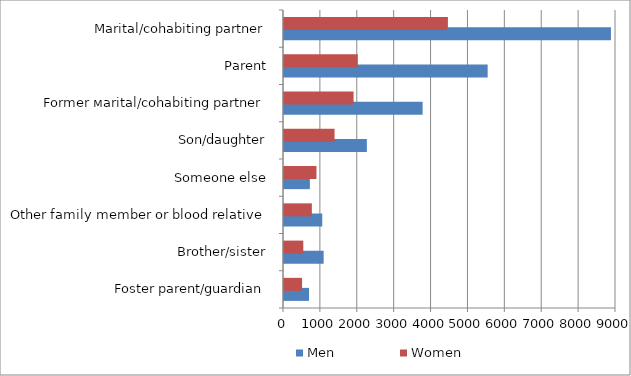
| Category | Men | Women |
|---|---|---|
| Foster parent/guardian | 678 | 490 |
| Brother/sister | 1075 | 523 |
| Other family member or blood relative | 1037 | 755 |
| Someone else | 701 | 880 |
| Son/daughter | 2246 | 1370 |
| Former мarital/cohabiting partner | 3758 | 1886 |
| Parent | 5521 | 2001 |
| Marital/cohabiting partner | 8863 | 4443 |